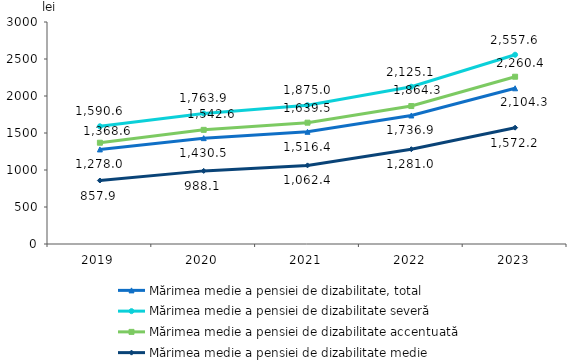
| Category | Mărimea medie a pensiei de dizabilitate, total | Mărimea medie a pensiei de dizabilitate severă | Mărimea medie a pensiei de dizabilitate accentuată | Mărimea medie a pensiei de dizabilitate medie |
|---|---|---|---|---|
| 2019.0 | 1278 | 1590.6 | 1368.6 | 857.9 |
| 2020.0 | 1430.5 | 1763.9 | 1542.6 | 988.1 |
| 2021.0 | 1516.4 | 1875 | 1639.5 | 1062.4 |
| 2022.0 | 1736.9 | 2125.1 | 1864.3 | 1281 |
| 2023.0 | 2104.3 | 2557.6 | 2260.4 | 1572.2 |